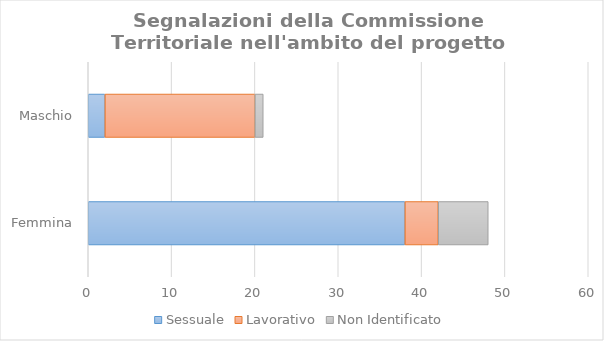
| Category | Sessuale | Lavorativo | Non Identificato |
|---|---|---|---|
| Femmina | 38 | 4 | 6 |
| Maschio | 2 | 18 | 1 |